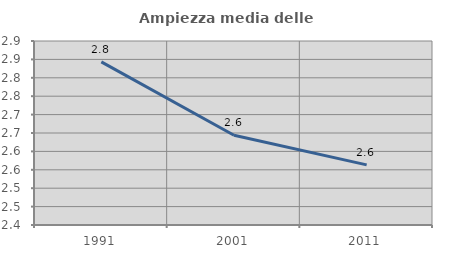
| Category | Ampiezza media delle famiglie |
|---|---|
| 1991.0 | 2.843 |
| 2001.0 | 2.644 |
| 2011.0 | 2.563 |